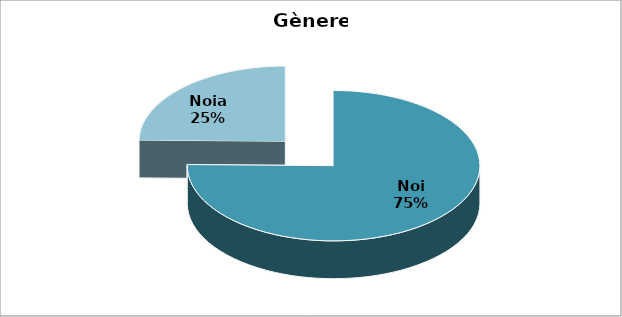
| Category | Grau en Matemàtiques- Gènere |
|---|---|
| Noi | 0.752 |
| Noia | 0.248 |